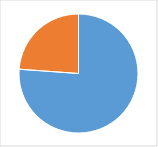
| Category | Series 0 |
|---|---|
| 0 | 0.707 |
| 1 | 0.221 |
| 2 | 0 |